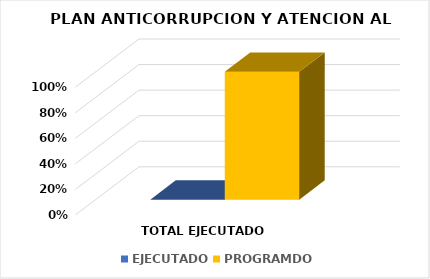
| Category | EJECUTADO | PROGRAMDO |
|---|---|---|
| TOTAL EJECUTADO | 0 | 1 |